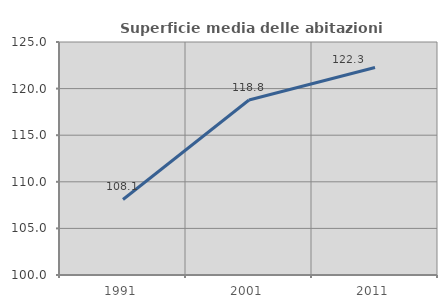
| Category | Superficie media delle abitazioni occupate |
|---|---|
| 1991.0 | 108.105 |
| 2001.0 | 118.771 |
| 2011.0 | 122.271 |